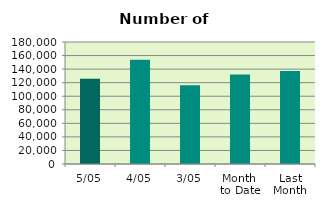
| Category | Series 0 |
|---|---|
| 5/05 | 125872 |
| 4/05 | 153988 |
| 3/05 | 116124 |
| Month 
to Date | 131994.667 |
| Last
Month | 137031.8 |